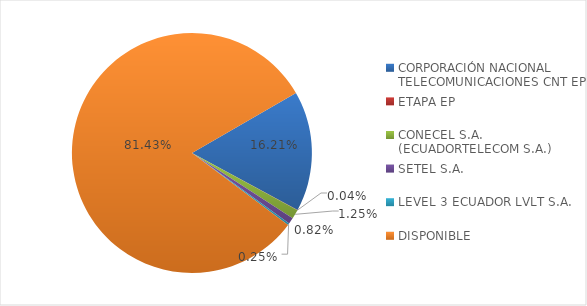
| Category | CODIGO DE AREA 2 |
|---|---|
| CORPORACIÓN NACIONAL TELECOMUNICACIONES CNT EP | 0.162 |
| ETAPA EP | 0 |
| CONECEL S.A. (ECUADORTELECOM S.A.) | 0.012 |
| SETEL S.A. | 0.008 |
| LEVEL 3 ECUADOR LVLT S.A. | 0.002 |
| DISPONIBLE | 0.814 |